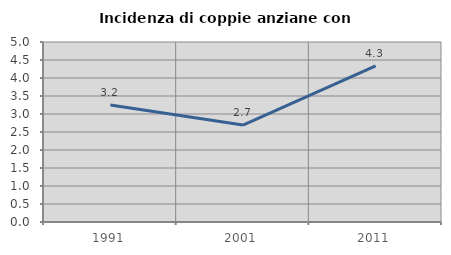
| Category | Incidenza di coppie anziane con figli |
|---|---|
| 1991.0 | 3.249 |
| 2001.0 | 2.694 |
| 2011.0 | 4.334 |